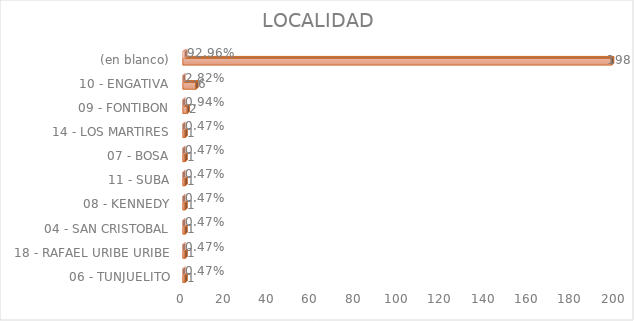
| Category | Cuenta de Número petición | Cuenta de Número petición2 |
|---|---|---|
| 06 - TUNJUELITO | 1 | 0.005 |
| 18 - RAFAEL URIBE URIBE | 1 | 0.005 |
| 04 - SAN CRISTOBAL | 1 | 0.005 |
| 08 - KENNEDY | 1 | 0.005 |
| 11 - SUBA | 1 | 0.005 |
| 07 - BOSA | 1 | 0.005 |
| 14 - LOS MARTIRES | 1 | 0.005 |
| 09 - FONTIBON | 2 | 0.009 |
| 10 - ENGATIVA | 6 | 0.028 |
| (en blanco) | 198 | 0.93 |